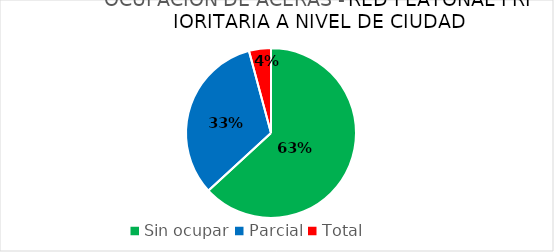
| Category | Series 0 | Series 1 |
|---|---|---|
| Sin ocupar | 269554 | 63.149 |
| Parcial | 139494 | 32.68 |
| Total | 17804 | 4.171 |